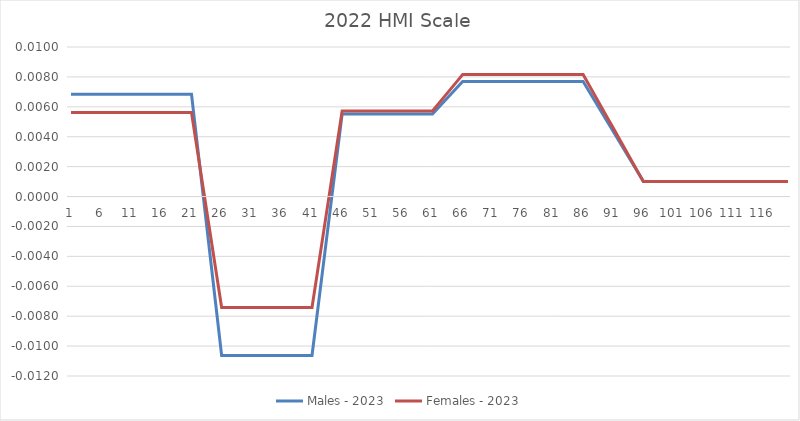
| Category |  Males - 2023  |  Females - 2023  |
|---|---|---|
| 0 | 0.007 | 0.006 |
| 1 | 0.007 | 0.006 |
| 2 | 0.007 | 0.006 |
| 3 | 0.007 | 0.006 |
| 4 | 0.007 | 0.006 |
| 5 | 0.007 | 0.006 |
| 6 | 0.007 | 0.006 |
| 7 | 0.007 | 0.006 |
| 8 | 0.007 | 0.006 |
| 9 | 0.007 | 0.006 |
| 10 | 0.007 | 0.006 |
| 11 | 0.007 | 0.006 |
| 12 | 0.007 | 0.006 |
| 13 | 0.007 | 0.006 |
| 14 | 0.007 | 0.006 |
| 15 | 0.007 | 0.006 |
| 16 | 0.007 | 0.006 |
| 17 | 0.007 | 0.006 |
| 18 | 0.007 | 0.006 |
| 19 | 0.007 | 0.006 |
| 20 | 0.007 | 0.006 |
| 21 | 0.003 | 0.003 |
| 22 | 0 | 0 |
| 23 | -0.004 | -0.002 |
| 24 | -0.007 | -0.005 |
| 25 | -0.011 | -0.007 |
| 26 | -0.011 | -0.007 |
| 27 | -0.011 | -0.007 |
| 28 | -0.011 | -0.007 |
| 29 | -0.011 | -0.007 |
| 30 | -0.011 | -0.007 |
| 31 | -0.011 | -0.007 |
| 32 | -0.011 | -0.007 |
| 33 | -0.011 | -0.007 |
| 34 | -0.011 | -0.007 |
| 35 | -0.011 | -0.007 |
| 36 | -0.011 | -0.007 |
| 37 | -0.011 | -0.007 |
| 38 | -0.011 | -0.007 |
| 39 | -0.011 | -0.007 |
| 40 | -0.011 | -0.007 |
| 41 | -0.007 | -0.005 |
| 42 | -0.004 | -0.002 |
| 43 | -0.001 | 0 |
| 44 | 0.002 | 0.003 |
| 45 | 0.006 | 0.006 |
| 46 | 0.006 | 0.006 |
| 47 | 0.006 | 0.006 |
| 48 | 0.006 | 0.006 |
| 49 | 0.006 | 0.006 |
| 50 | 0.006 | 0.006 |
| 51 | 0.006 | 0.006 |
| 52 | 0.006 | 0.006 |
| 53 | 0.006 | 0.006 |
| 54 | 0.006 | 0.006 |
| 55 | 0.006 | 0.006 |
| 56 | 0.006 | 0.006 |
| 57 | 0.006 | 0.006 |
| 58 | 0.006 | 0.006 |
| 59 | 0.006 | 0.006 |
| 60 | 0.006 | 0.006 |
| 61 | 0.006 | 0.006 |
| 62 | 0.006 | 0.007 |
| 63 | 0.007 | 0.007 |
| 64 | 0.007 | 0.008 |
| 65 | 0.008 | 0.008 |
| 66 | 0.008 | 0.008 |
| 67 | 0.008 | 0.008 |
| 68 | 0.008 | 0.008 |
| 69 | 0.008 | 0.008 |
| 70 | 0.008 | 0.008 |
| 71 | 0.008 | 0.008 |
| 72 | 0.008 | 0.008 |
| 73 | 0.008 | 0.008 |
| 74 | 0.008 | 0.008 |
| 75 | 0.008 | 0.008 |
| 76 | 0.008 | 0.008 |
| 77 | 0.008 | 0.008 |
| 78 | 0.008 | 0.008 |
| 79 | 0.008 | 0.008 |
| 80 | 0.008 | 0.008 |
| 81 | 0.008 | 0.008 |
| 82 | 0.008 | 0.008 |
| 83 | 0.008 | 0.008 |
| 84 | 0.008 | 0.008 |
| 85 | 0.008 | 0.008 |
| 86 | 0.007 | 0.007 |
| 87 | 0.006 | 0.007 |
| 88 | 0.006 | 0.006 |
| 89 | 0.005 | 0.005 |
| 90 | 0.004 | 0.005 |
| 91 | 0.004 | 0.004 |
| 92 | 0.003 | 0.003 |
| 93 | 0.002 | 0.002 |
| 94 | 0.002 | 0.002 |
| 95 | 0.001 | 0.001 |
| 96 | 0.001 | 0.001 |
| 97 | 0.001 | 0.001 |
| 98 | 0.001 | 0.001 |
| 99 | 0.001 | 0.001 |
| 100 | 0.001 | 0.001 |
| 101 | 0.001 | 0.001 |
| 102 | 0.001 | 0.001 |
| 103 | 0.001 | 0.001 |
| 104 | 0.001 | 0.001 |
| 105 | 0.001 | 0.001 |
| 106 | 0.001 | 0.001 |
| 107 | 0.001 | 0.001 |
| 108 | 0.001 | 0.001 |
| 109 | 0.001 | 0.001 |
| 110 | 0.001 | 0.001 |
| 111 | 0.001 | 0.001 |
| 112 | 0.001 | 0.001 |
| 113 | 0.001 | 0.001 |
| 114 | 0.001 | 0.001 |
| 115 | 0.001 | 0.001 |
| 116 | 0.001 | 0.001 |
| 117 | 0.001 | 0.001 |
| 118 | 0.001 | 0.001 |
| 119 | 0.001 | 0.001 |